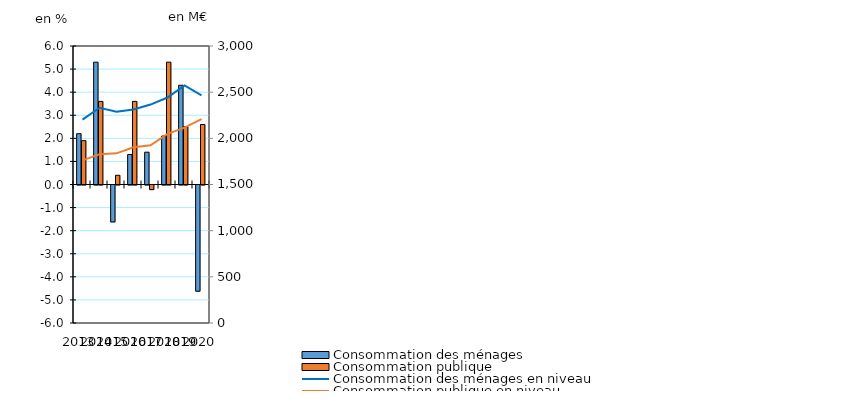
| Category | Consommation des ménages | Consommation publique |
|---|---|---|
| 2013.0 | 2.2 | 1.9 |
| 2014.0 | 5.3 | 3.6 |
| 2015.0 | -1.6 | 0.4 |
| 2016.0 | 1.3 | 3.6 |
| 2017.0 | 1.4 | -0.2 |
| 2018.0 | 2.1 | 5.3 |
| 2019.0 | 4.3 | 2.5 |
| 2020.0 | -4.6 | 2.6 |